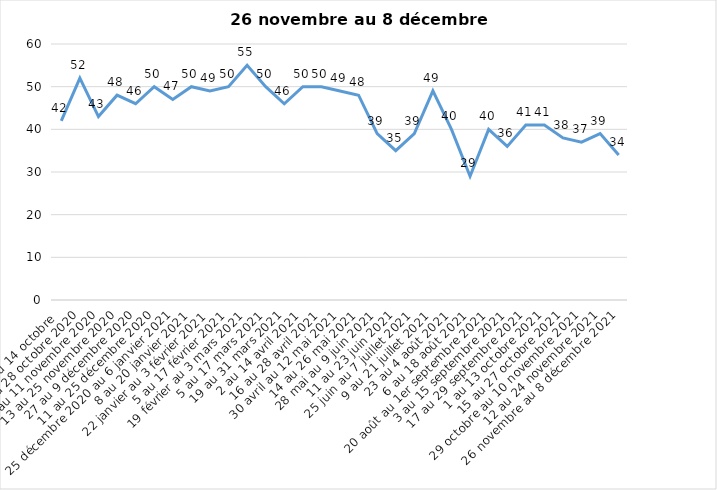
| Category | Toujours aux trois mesures |
|---|---|
| 2 au 14 octobre  | 42 |
| 16 au 28 octobre 2020 | 52 |
| 30 octobre au 11 novembre 2020 | 43 |
| 13 au 25 novembre 2020 | 48 |
| 27 au 9 décembre 2020 | 46 |
| 11 au 25 décembre 2020 | 50 |
| 25 décembre 2020 au 6 janvier 2021 | 47 |
| 8 au 20 janvier 2021 | 50 |
| 22 janvier au 3 février 2021 | 49 |
| 5 au 17 février 2021 | 50 |
| 19 février au 3 mars 2021 | 55 |
| 5 au 17 mars 2021 | 50 |
| 19 au 31 mars 2021 | 46 |
| 2 au 14 avril 2021 | 50 |
| 16 au 28 avril 2021 | 50 |
| 30 avril au 12 mai 2021 | 49 |
| 14 au 26 mai 2021 | 48 |
| 28 mai au 9 juin 2021 | 39 |
| 11 au 23 juin 2021 | 35 |
| 25 juin au 7 juillet 2021 | 39 |
| 9 au 21 juillet 2021 | 49 |
| 23 au 4 août 2021 | 40 |
| 6 au 18 août 2021 | 29 |
| 20 août au 1er septembre 2021 | 40 |
| 3 au 15 septembre 2021 | 36 |
| 17 au 29 septembre 2021 | 41 |
| 1 au 13 octobre 2021 | 41 |
| 15 au 27 octobre 2021 | 38 |
| 29 octobre au 10 novembre 2021 | 37 |
| 12 au 24 novembre 2021 | 39 |
| 26 novembre au 8 décembre 2021 | 34 |